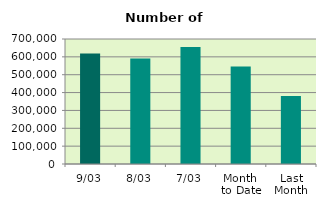
| Category | Series 0 |
|---|---|
| 9/03 | 618994 |
| 8/03 | 591262 |
| 7/03 | 655244 |
| Month 
to Date | 546126.286 |
| Last
Month | 380345.4 |